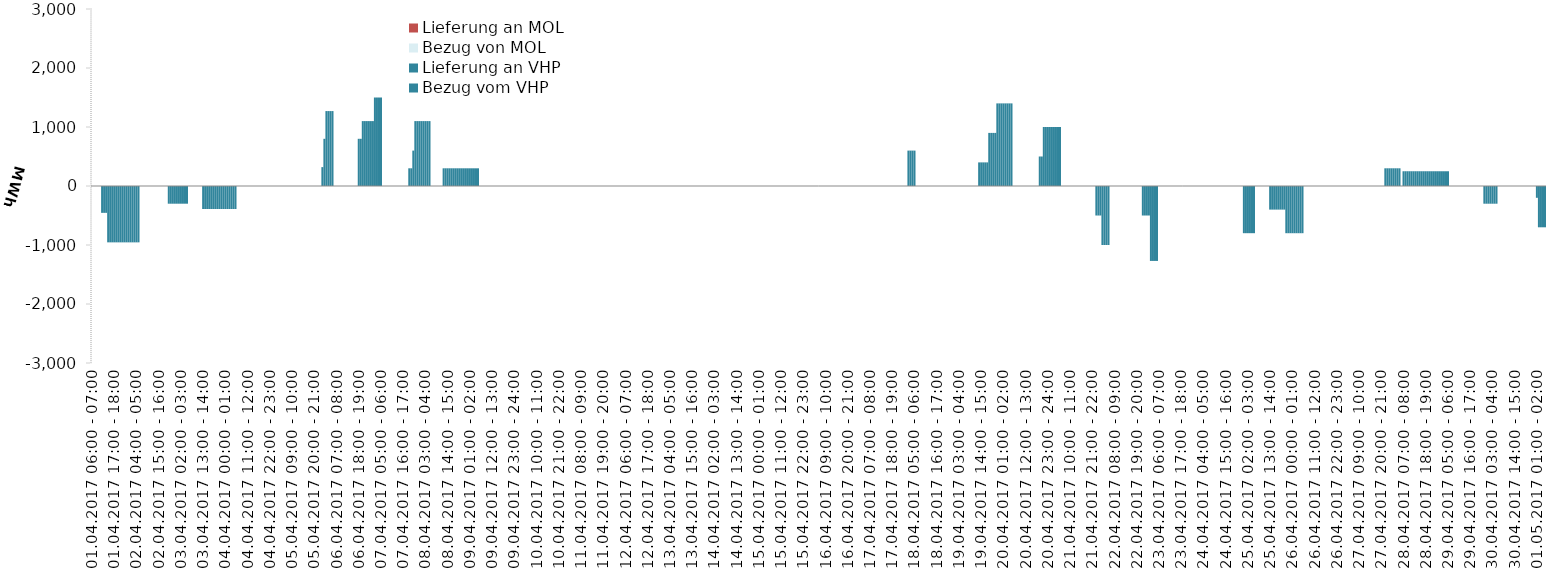
| Category | Bezug vom VHP | Lieferung an VHP | Bezug von MOL | Lieferung an MOL |
|---|---|---|---|---|
| 01.04.2017 06:00 - 07:00 | 0 | 0 | 0 | 0 |
| 01.04.2017 07:00 - 08:00 | 0 | 0 | 0 | 0 |
| 01.04.2017 08:00 - 09:00 | 0 | 0 | 0 | 0 |
| 01.04.2017 09:00 - 10:00 | 0 | 0 | 0 | 0 |
| 01.04.2017 10:00 - 11:00 | 0 | 0 | 0 | 0 |
| 01.04.2017 11:00 - 12:00 | 0 | -455 | 0 | 0 |
| 01.04.2017 12:00 - 13:00 | 0 | -455 | 0 | 0 |
| 01.04.2017 13:00 - 14:00 | 0 | -455 | 0 | 0 |
| 01.04.2017 14:00 - 15:00 | 0 | -955 | 0 | 0 |
| 01.04.2017 15:00 - 16:00 | 0 | -955 | 0 | 0 |
| 01.04.2017 16:00 - 17:00 | 0 | -955 | 0 | 0 |
| 01.04.2017 17:00 - 18:00 | 0 | -955 | 0 | 0 |
| 01.04.2017 18:00 - 19:00 | 0 | -955 | 0 | 0 |
| 01.04.2017 19:00 - 20:00 | 0 | -955 | 0 | 0 |
| 01.04.2017 20:00 - 21:00 | 0 | -955 | 0 | 0 |
| 01.04.2017 21:00 - 22:00 | 0 | -955 | 0 | 0 |
| 01.04.2017 22:00 - 23:00 | 0 | -955 | 0 | 0 |
| 01.04.2017 23:00 - 24:00 | 0 | -955 | 0 | 0 |
| 02.04.2017 00:00 - 01:00 | 0 | -955 | 0 | 0 |
| 02.04.2017 01:00 - 02:00 | 0 | -955 | 0 | 0 |
| 02.04.2017 02:00 - 03:00 | 0 | -955 | 0 | 0 |
| 02.04.2017 03:00 - 04:00 | 0 | -955 | 0 | 0 |
| 02.04.2017 04:00 - 05:00 | 0 | -955 | 0 | 0 |
| 02.04.2017 05:00 - 06:00 | 0 | -955 | 0 | 0 |
| 02.04.2017 06:00 - 07:00 | 0 | 0 | 0 | 0 |
| 02.04.2017 07:00 - 08:00 | 0 | 0 | 0 | 0 |
| 02.04.2017 08:00 - 09:00 | 0 | 0 | 0 | 0 |
| 02.04.2017 09:00 - 10:00 | 0 | 0 | 0 | 0 |
| 02.04.2017 10:00 - 11:00 | 0 | 0 | 0 | 0 |
| 02.04.2017 11:00 - 12:00 | 0 | 0 | 0 | 0 |
| 02.04.2017 12:00 - 13:00 | 0 | 0 | 0 | 0 |
| 02.04.2017 13:00 - 14:00 | 0 | 0 | 0 | 0 |
| 02.04.2017 14:00 - 15:00 | 0 | 0 | 0 | 0 |
| 02.04.2017 15:00 - 16:00 | 0 | 0 | 0 | 0 |
| 02.04.2017 16:00 - 17:00 | 0 | 0 | 0 | 0 |
| 02.04.2017 17:00 - 18:00 | 0 | 0 | 0 | 0 |
| 02.04.2017 18:00 - 19:00 | 0 | 0 | 0 | 0 |
| 02.04.2017 19:00 - 20:00 | 0 | 0 | 0 | 0 |
| 02.04.2017 20:00 - 21:00 | 0 | -300 | 0 | 0 |
| 02.04.2017 21:00 - 22:00 | 0 | -300 | 0 | 0 |
| 02.04.2017 22:00 - 23:00 | 0 | -300 | 0 | 0 |
| 02.04.2017 23:00 - 24:00 | 0 | -300 | 0 | 0 |
| 03.04.2017 00:00 - 01:00 | 0 | -300 | 0 | 0 |
| 03.04.2017 01:00 - 02:00 | 0 | -300 | 0 | 0 |
| 03.04.2017 02:00 - 03:00 | 0 | -300 | 0 | 0 |
| 03.04.2017 03:00 - 04:00 | 0 | -300 | 0 | 0 |
| 03.04.2017 04:00 - 05:00 | 0 | -300 | 0 | 0 |
| 03.04.2017 05:00 - 06:00 | 0 | -300 | 0 | 0 |
| 03.04.2017 06:00 - 07:00 | 0 | 0 | 0 | 0 |
| 03.04.2017 07:00 - 08:00 | 0 | 0 | 0 | 0 |
| 03.04.2017 08:00 - 09:00 | 0 | 0 | 0 | 0 |
| 03.04.2017 09:00 - 10:00 | 0 | 0 | 0 | 0 |
| 03.04.2017 10:00 - 11:00 | 0 | 0 | 0 | 0 |
| 03.04.2017 11:00 - 12:00 | 0 | 0 | 0 | 0 |
| 03.04.2017 12:00 - 13:00 | 0 | 0 | 0 | 0 |
| 03.04.2017 13:00 - 14:00 | 0 | -390 | 0 | 0 |
| 03.04.2017 14:00 - 15:00 | 0 | -390 | 0 | 0 |
| 03.04.2017 15:00 - 16:00 | 0 | -390 | 0 | 0 |
| 03.04.2017 16:00 - 17:00 | 0 | -390 | 0 | 0 |
| 03.04.2017 17:00 - 18:00 | 0 | -390 | 0 | 0 |
| 03.04.2017 18:00 - 19:00 | 0 | -390 | 0 | 0 |
| 03.04.2017 19:00 - 20:00 | 0 | -390 | 0 | 0 |
| 03.04.2017 20:00 - 21:00 | 0 | -390 | 0 | 0 |
| 03.04.2017 21:00 - 22:00 | 0 | -390 | 0 | 0 |
| 03.04.2017 22:00 - 23:00 | 0 | -390 | 0 | 0 |
| 03.04.2017 23:00 - 24:00 | 0 | -390 | 0 | 0 |
| 04.04.2017 00:00 - 01:00 | 0 | -390 | 0 | 0 |
| 04.04.2017 01:00 - 02:00 | 0 | -390 | 0 | 0 |
| 04.04.2017 02:00 - 03:00 | 0 | -390 | 0 | 0 |
| 04.04.2017 03:00 - 04:00 | 0 | -390 | 0 | 0 |
| 04.04.2017 04:00 - 05:00 | 0 | -390 | 0 | 0 |
| 04.04.2017 05:00 - 06:00 | 0 | -390 | 0 | 0 |
| 04.04.2017 06:00 - 07:00 | 0 | 0 | 0 | 0 |
| 04.04.2017 07:00 - 08:00 | 0 | 0 | 0 | 0 |
| 04.04.2017 08:00 - 09:00 | 0 | 0 | 0 | 0 |
| 04.04.2017 09:00 - 10:00 | 0 | 0 | 0 | 0 |
| 04.04.2017 10:00 - 11:00 | 0 | 0 | 0 | 0 |
| 04.04.2017 11:00 - 12:00 | 0 | 0 | 0 | 0 |
| 04.04.2017 12:00 - 13:00 | 0 | 0 | 0 | 0 |
| 04.04.2017 13:00 - 14:00 | 0 | 0 | 0 | 0 |
| 04.04.2017 14:00 - 15:00 | 0 | 0 | 0 | 0 |
| 04.04.2017 15:00 - 16:00 | 0 | 0 | 0 | 0 |
| 04.04.2017 16:00 - 17:00 | 0 | 0 | 0 | 0 |
| 04.04.2017 17:00 - 18:00 | 0 | 0 | 0 | 0 |
| 04.04.2017 18:00 - 19:00 | 0 | 0 | 0 | 0 |
| 04.04.2017 19:00 - 20:00 | 0 | 0 | 0 | 0 |
| 04.04.2017 20:00 - 21:00 | 0 | 0 | 0 | 0 |
| 04.04.2017 21:00 - 22:00 | 0 | 0 | 0 | 0 |
| 04.04.2017 22:00 - 23:00 | 0 | 0 | 0 | 0 |
| 04.04.2017 23:00 - 24:00 | 0 | 0 | 0 | 0 |
| 05.04.2017 00:00 - 01:00 | 0 | 0 | 0 | 0 |
| 05.04.2017 01:00 - 02:00 | 0 | 0 | 0 | 0 |
| 05.04.2017 02:00 - 03:00 | 0 | 0 | 0 | 0 |
| 05.04.2017 03:00 - 04:00 | 0 | 0 | 0 | 0 |
| 05.04.2017 04:00 - 05:00 | 0 | 0 | 0 | 0 |
| 05.04.2017 05:00 - 06:00 | 0 | 0 | 0 | 0 |
| 05.04.2017 06:00 - 07:00 | 0 | 0 | 0 | 0 |
| 05.04.2017 07:00 - 08:00 | 0 | 0 | 0 | 0 |
| 05.04.2017 08:00 - 09:00 | 0 | 0 | 0 | 0 |
| 05.04.2017 09:00 - 10:00 | 0 | 0 | 0 | 0 |
| 05.04.2017 10:00 - 11:00 | 0 | 0 | 0 | 0 |
| 05.04.2017 11:00 - 12:00 | 0 | 0 | 0 | 0 |
| 05.04.2017 12:00 - 13:00 | 0 | 0 | 0 | 0 |
| 05.04.2017 13:00 - 14:00 | 0 | 0 | 0 | 0 |
| 05.04.2017 14:00 - 15:00 | 0 | 0 | 0 | 0 |
| 05.04.2017 15:00 - 16:00 | 0 | 0 | 0 | 0 |
| 05.04.2017 16:00 - 17:00 | 0 | 0 | 0 | 0 |
| 05.04.2017 17:00 - 18:00 | 0 | 0 | 0 | 0 |
| 05.04.2017 18:00 - 19:00 | 0 | 0 | 0 | 0 |
| 05.04.2017 19:00 - 20:00 | 0 | 0 | 0 | 0 |
| 05.04.2017 20:00 - 21:00 | 0 | 0 | 0 | 0 |
| 05.04.2017 21:00 - 22:00 | 0 | 0 | 0 | 0 |
| 05.04.2017 22:00 - 23:00 | 0 | 0 | 0 | 0 |
| 05.04.2017 23:00 - 24:00 | 0 | 0 | 0 | 0 |
| 06.04.2017 00:00 - 01:00 | 320 | 0 | 0 | 0 |
| 06.04.2017 01:00 - 02:00 | 800 | 0 | 0 | 0 |
| 06.04.2017 02:00 - 03:00 | 1270 | 0 | 0 | 0 |
| 06.04.2017 03:00 - 04:00 | 1270 | 0 | 0 | 0 |
| 06.04.2017 04:00 - 05:00 | 1270 | 0 | 0 | 0 |
| 06.04.2017 05:00 - 06:00 | 1270 | 0 | 0 | 0 |
| 06.04.2017 06:00 - 07:00 | 0 | 0 | 0 | 0 |
| 06.04.2017 07:00 - 08:00 | 0 | 0 | 0 | 0 |
| 06.04.2017 08:00 - 09:00 | 0 | 0 | 0 | 0 |
| 06.04.2017 09:00 - 10:00 | 0 | 0 | 0 | 0 |
| 06.04.2017 10:00 - 11:00 | 0 | 0 | 0 | 0 |
| 06.04.2017 11:00 - 12:00 | 0 | 0 | 0 | 0 |
| 06.04.2017 12:00 - 13:00 | 0 | 0 | 0 | 0 |
| 06.04.2017 13:00 - 14:00 | 0 | 0 | 0 | 0 |
| 06.04.2017 14:00 - 15:00 | 0 | 0 | 0 | 0 |
| 06.04.2017 15:00 - 16:00 | 0 | 0 | 0 | 0 |
| 06.04.2017 16:00 - 17:00 | 0 | 0 | 0 | 0 |
| 06.04.2017 17:00 - 18:00 | 0 | 0 | 0 | 0 |
| 06.04.2017 18:00 - 19:00 | 800 | 0 | 0 | 0 |
| 06.04.2017 19:00 - 20:00 | 800 | 0 | 0 | 0 |
| 06.04.2017 20:00 - 21:00 | 1100 | 0 | 0 | 0 |
| 06.04.2017 21:00 - 22:00 | 1100 | 0 | 0 | 0 |
| 06.04.2017 22:00 - 23:00 | 1100 | 0 | 0 | 0 |
| 06.04.2017 23:00 - 24:00 | 1100 | 0 | 0 | 0 |
| 07.04.2017 00:00 - 01:00 | 1100 | 0 | 0 | 0 |
| 07.04.2017 01:00 - 02:00 | 1100 | 0 | 0 | 0 |
| 07.04.2017 02:00 - 03:00 | 1500 | 0 | 0 | 0 |
| 07.04.2017 03:00 - 04:00 | 1500 | 0 | 0 | 0 |
| 07.04.2017 04:00 - 05:00 | 1500 | 0 | 0 | 0 |
| 07.04.2017 05:00 - 06:00 | 1500 | 0 | 0 | 0 |
| 07.04.2017 06:00 - 07:00 | 0 | 0 | 0 | 0 |
| 07.04.2017 07:00 - 08:00 | 0 | 0 | 0 | 0 |
| 07.04.2017 08:00 - 09:00 | 0 | 0 | 0 | 0 |
| 07.04.2017 09:00 - 10:00 | 0 | 0 | 0 | 0 |
| 07.04.2017 10:00 - 11:00 | 0 | 0 | 0 | 0 |
| 07.04.2017 11:00 - 12:00 | 0 | 0 | 0 | 0 |
| 07.04.2017 12:00 - 13:00 | 0 | 0 | 0 | 0 |
| 07.04.2017 13:00 - 14:00 | 0 | 0 | 0 | 0 |
| 07.04.2017 14:00 - 15:00 | 0 | 0 | 0 | 0 |
| 07.04.2017 15:00 - 16:00 | 0 | 0 | 0 | 0 |
| 07.04.2017 16:00 - 17:00 | 0 | 0 | 0 | 0 |
| 07.04.2017 17:00 - 18:00 | 0 | 0 | 0 | 0 |
| 07.04.2017 18:00 - 19:00 | 0 | 0 | 0 | 0 |
| 07.04.2017 19:00 - 20:00 | 300 | 0 | 0 | 0 |
| 07.04.2017 20:00 - 21:00 | 300 | 0 | 0 | 0 |
| 07.04.2017 21:00 - 22:00 | 600 | 0 | 0 | 0 |
| 07.04.2017 22:00 - 23:00 | 1100 | 0 | 0 | 0 |
| 07.04.2017 23:00 - 24:00 | 1100 | 0 | 0 | 0 |
| 08.04.2017 00:00 - 01:00 | 1100 | 0 | 0 | 0 |
| 08.04.2017 01:00 - 02:00 | 1100 | 0 | 0 | 0 |
| 08.04.2017 02:00 - 03:00 | 1100 | 0 | 0 | 0 |
| 08.04.2017 03:00 - 04:00 | 1100 | 0 | 0 | 0 |
| 08.04.2017 04:00 - 05:00 | 1100 | 0 | 0 | 0 |
| 08.04.2017 05:00 - 06:00 | 1100 | 0 | 0 | 0 |
| 08.04.2017 06:00 - 07:00 | 0 | 0 | 0 | 0 |
| 08.04.2017 07:00 - 08:00 | 0 | 0 | 0 | 0 |
| 08.04.2017 08:00 - 09:00 | 0 | 0 | 0 | 0 |
| 08.04.2017 09:00 - 10:00 | 0 | 0 | 0 | 0 |
| 08.04.2017 10:00 - 11:00 | 0 | 0 | 0 | 0 |
| 08.04.2017 11:00 - 12:00 | 0 | 0 | 0 | 0 |
| 08.04.2017 12:00 - 13:00 | 300 | 0 | 0 | 0 |
| 08.04.2017 13:00 - 14:00 | 300 | 0 | 0 | 0 |
| 08.04.2017 14:00 - 15:00 | 300 | 0 | 0 | 0 |
| 08.04.2017 15:00 - 16:00 | 300 | 0 | 0 | 0 |
| 08.04.2017 16:00 - 17:00 | 300 | 0 | 0 | 0 |
| 08.04.2017 17:00 - 18:00 | 300 | 0 | 0 | 0 |
| 08.04.2017 18:00 - 19:00 | 300 | 0 | 0 | 0 |
| 08.04.2017 19:00 - 20:00 | 300 | 0 | 0 | 0 |
| 08.04.2017 20:00 - 21:00 | 300 | 0 | 0 | 0 |
| 08.04.2017 21:00 - 22:00 | 300 | 0 | 0 | 0 |
| 08.04.2017 22:00 - 23:00 | 300 | 0 | 0 | 0 |
| 08.04.2017 23:00 - 24:00 | 300 | 0 | 0 | 0 |
| 09.04.2017 00:00 - 01:00 | 300 | 0 | 0 | 0 |
| 09.04.2017 01:00 - 02:00 | 300 | 0 | 0 | 0 |
| 09.04.2017 02:00 - 03:00 | 300 | 0 | 0 | 0 |
| 09.04.2017 03:00 - 04:00 | 300 | 0 | 0 | 0 |
| 09.04.2017 04:00 - 05:00 | 300 | 0 | 0 | 0 |
| 09.04.2017 05:00 - 06:00 | 300 | 0 | 0 | 0 |
| 09.04.2017 06:00 - 07:00 | 0 | 0 | 0 | 0 |
| 09.04.2017 07:00 - 08:00 | 0 | 0 | 0 | 0 |
| 09.04.2017 08:00 - 09:00 | 0 | 0 | 0 | 0 |
| 09.04.2017 09:00 - 10:00 | 0 | 0 | 0 | 0 |
| 09.04.2017 10:00 - 11:00 | 0 | 0 | 0 | 0 |
| 09.04.2017 11:00 - 12:00 | 0 | 0 | 0 | 0 |
| 09.04.2017 12:00 - 13:00 | 0 | 0 | 0 | 0 |
| 09.04.2017 13:00 - 14:00 | 0 | 0 | 0 | 0 |
| 09.04.2017 14:00 - 15:00 | 0 | 0 | 0 | 0 |
| 09.04.2017 15:00 - 16:00 | 0 | 0 | 0 | 0 |
| 09.04.2017 16:00 - 17:00 | 0 | 0 | 0 | 0 |
| 09.04.2017 17:00 - 18:00 | 0 | 0 | 0 | 0 |
| 09.04.2017 18:00 - 19:00 | 0 | 0 | 0 | 0 |
| 09.04.2017 19:00 - 20:00 | 0 | 0 | 0 | 0 |
| 09.04.2017 20:00 - 21:00 | 0 | 0 | 0 | 0 |
| 09.04.2017 21:00 - 22:00 | 0 | 0 | 0 | 0 |
| 09.04.2017 22:00 - 23:00 | 0 | 0 | 0 | 0 |
| 09.04.2017 23:00 - 24:00 | 0 | 0 | 0 | 0 |
| 10.04.2017 00:00 - 01:00 | 0 | 0 | 0 | 0 |
| 10.04.2017 01:00 - 02:00 | 0 | 0 | 0 | 0 |
| 10.04.2017 02:00 - 03:00 | 0 | 0 | 0 | 0 |
| 10.04.2017 03:00 - 04:00 | 0 | 0 | 0 | 0 |
| 10.04.2017 04:00 - 05:00 | 0 | 0 | 0 | 0 |
| 10.04.2017 05:00 - 06:00 | 0 | 0 | 0 | 0 |
| 10.04.2017 06:00 - 07:00 | 0 | 0 | 0 | 0 |
| 10.04.2017 07:00 - 08:00 | 0 | 0 | 0 | 0 |
| 10.04.2017 08:00 - 09:00 | 0 | 0 | 0 | 0 |
| 10.04.2017 09:00 - 10:00 | 0 | 0 | 0 | 0 |
| 10.04.2017 10:00 - 11:00 | 0 | 0 | 0 | 0 |
| 10.04.2017 11:00 - 12:00 | 0 | 0 | 0 | 0 |
| 10.04.2017 12:00 - 13:00 | 0 | 0 | 0 | 0 |
| 10.04.2017 13:00 - 14:00 | 0 | 0 | 0 | 0 |
| 10.04.2017 14:00 - 15:00 | 0 | 0 | 0 | 0 |
| 10.04.2017 15:00 - 16:00 | 0 | 0 | 0 | 0 |
| 10.04.2017 16:00 - 17:00 | 0 | 0 | 0 | 0 |
| 10.04.2017 17:00 - 18:00 | 0 | 0 | 0 | 0 |
| 10.04.2017 18:00 - 19:00 | 0 | 0 | 0 | 0 |
| 10.04.2017 19:00 - 20:00 | 0 | 0 | 0 | 0 |
| 10.04.2017 20:00 - 21:00 | 0 | 0 | 0 | 0 |
| 10.04.2017 21:00 - 22:00 | 0 | 0 | 0 | 0 |
| 10.04.2017 22:00 - 23:00 | 0 | 0 | 0 | 0 |
| 10.04.2017 23:00 - 24:00 | 0 | 0 | 0 | 0 |
| 11.04.2017 00:00 - 01:00 | 0 | 0 | 0 | 0 |
| 11.04.2017 01:00 - 02:00 | 0 | 0 | 0 | 0 |
| 11.04.2017 02:00 - 03:00 | 0 | 0 | 0 | 0 |
| 11.04.2017 03:00 - 04:00 | 0 | 0 | 0 | 0 |
| 11.04.2017 04:00 - 05:00 | 0 | 0 | 0 | 0 |
| 11.04.2017 05:00 - 06:00 | 0 | 0 | 0 | 0 |
| 11.04.2017 06:00 - 07:00 | 0 | 0 | 0 | 0 |
| 11.04.2017 07:00 - 08:00 | 0 | 0 | 0 | 0 |
| 11.04.2017 08:00 - 09:00 | 0 | 0 | 0 | 0 |
| 11.04.2017 09:00 - 10:00 | 0 | 0 | 0 | 0 |
| 11.04.2017 10:00 - 11:00 | 0 | 0 | 0 | 0 |
| 11.04.2017 11:00 - 12:00 | 0 | 0 | 0 | 0 |
| 11.04.2017 12:00 - 13:00 | 0 | 0 | 0 | 0 |
| 11.04.2017 13:00 - 14:00 | 0 | 0 | 0 | 0 |
| 11.04.2017 14:00 - 15:00 | 0 | 0 | 0 | 0 |
| 11.04.2017 15:00 - 16:00 | 0 | 0 | 0 | 0 |
| 11.04.2017 16:00 - 17:00 | 0 | 0 | 0 | 0 |
| 11.04.2017 17:00 - 18:00 | 0 | 0 | 0 | 0 |
| 11.04.2017 18:00 - 19:00 | 0 | 0 | 0 | 0 |
| 11.04.2017 19:00 - 20:00 | 0 | 0 | 0 | 0 |
| 11.04.2017 20:00 - 21:00 | 0 | 0 | 0 | 0 |
| 11.04.2017 21:00 - 22:00 | 0 | 0 | 0 | 0 |
| 11.04.2017 22:00 - 23:00 | 0 | 0 | 0 | 0 |
| 11.04.2017 23:00 - 24:00 | 0 | 0 | 0 | 0 |
| 12.04.2017 00:00 - 01:00 | 0 | 0 | 0 | 0 |
| 12.04.2017 01:00 - 02:00 | 0 | 0 | 0 | 0 |
| 12.04.2017 02:00 - 03:00 | 0 | 0 | 0 | 0 |
| 12.04.2017 03:00 - 04:00 | 0 | 0 | 0 | 0 |
| 12.04.2017 04:00 - 05:00 | 0 | 0 | 0 | 0 |
| 12.04.2017 05:00 - 06:00 | 0 | 0 | 0 | 0 |
| 12.04.2017 06:00 - 07:00 | 0 | 0 | 0 | 0 |
| 12.04.2017 07:00 - 08:00 | 0 | 0 | 0 | 0 |
| 12.04.2017 08:00 - 09:00 | 0 | 0 | 0 | 0 |
| 12.04.2017 09:00 - 10:00 | 0 | 0 | 0 | 0 |
| 12.04.2017 10:00 - 11:00 | 0 | 0 | 0 | 0 |
| 12.04.2017 11:00 - 12:00 | 0 | 0 | 0 | 0 |
| 12.04.2017 12:00 - 13:00 | 0 | 0 | 0 | 0 |
| 12.04.2017 13:00 - 14:00 | 0 | 0 | 0 | 0 |
| 12.04.2017 14:00 - 15:00 | 0 | 0 | 0 | 0 |
| 12.04.2017 15:00 - 16:00 | 0 | 0 | 0 | 0 |
| 12.04.2017 16:00 - 17:00 | 0 | 0 | 0 | 0 |
| 12.04.2017 17:00 - 18:00 | 0 | 0 | 0 | 0 |
| 12.04.2017 18:00 - 19:00 | 0 | 0 | 0 | 0 |
| 12.04.2017 19:00 - 20:00 | 0 | 0 | 0 | 0 |
| 12.04.2017 20:00 - 21:00 | 0 | 0 | 0 | 0 |
| 12.04.2017 21:00 - 22:00 | 0 | 0 | 0 | 0 |
| 12.04.2017 22:00 - 23:00 | 0 | 0 | 0 | 0 |
| 12.04.2017 23:00 - 24:00 | 0 | 0 | 0 | 0 |
| 13.04.2017 00:00 - 01:00 | 0 | 0 | 0 | 0 |
| 13.04.2017 01:00 - 02:00 | 0 | 0 | 0 | 0 |
| 13.04.2017 02:00 - 03:00 | 0 | 0 | 0 | 0 |
| 13.04.2017 03:00 - 04:00 | 0 | 0 | 0 | 0 |
| 13.04.2017 04:00 - 05:00 | 0 | 0 | 0 | 0 |
| 13.04.2017 05:00 - 06:00 | 0 | 0 | 0 | 0 |
| 13.04.2017 06:00 - 07:00 | 0 | 0 | 0 | 0 |
| 13.04.2017 07:00 - 08:00 | 0 | 0 | 0 | 0 |
| 13.04.2017 08:00 - 09:00 | 0 | 0 | 0 | 0 |
| 13.04.2017 09:00 - 10:00 | 0 | 0 | 0 | 0 |
| 13.04.2017 10:00 - 11:00 | 0 | 0 | 0 | 0 |
| 13.04.2017 11:00 - 12:00 | 0 | 0 | 0 | 0 |
| 13.04.2017 12:00 - 13:00 | 0 | 0 | 0 | 0 |
| 13.04.2017 13:00 - 14:00 | 0 | 0 | 0 | 0 |
| 13.04.2017 14:00 - 15:00 | 0 | 0 | 0 | 0 |
| 13.04.2017 15:00 - 16:00 | 0 | 0 | 0 | 0 |
| 13.04.2017 16:00 - 17:00 | 0 | 0 | 0 | 0 |
| 13.04.2017 17:00 - 18:00 | 0 | 0 | 0 | 0 |
| 13.04.2017 18:00 - 19:00 | 0 | 0 | 0 | 0 |
| 13.04.2017 19:00 - 20:00 | 0 | 0 | 0 | 0 |
| 13.04.2017 20:00 - 21:00 | 0 | 0 | 0 | 0 |
| 13.04.2017 21:00 - 22:00 | 0 | 0 | 0 | 0 |
| 13.04.2017 22:00 - 23:00 | 0 | 0 | 0 | 0 |
| 13.04.2017 23:00 - 24:00 | 0 | 0 | 0 | 0 |
| 14.04.2017 00:00 - 01:00 | 0 | 0 | 0 | 0 |
| 14.04.2017 01:00 - 02:00 | 0 | 0 | 0 | 0 |
| 14.04.2017 02:00 - 03:00 | 0 | 0 | 0 | 0 |
| 14.04.2017 03:00 - 04:00 | 0 | 0 | 0 | 0 |
| 14.04.2017 04:00 - 05:00 | 0 | 0 | 0 | 0 |
| 14.04.2017 05:00 - 06:00 | 0 | 0 | 0 | 0 |
| 14.04.2017 06:00 - 07:00 | 0 | 0 | 0 | 0 |
| 14.04.2017 07:00 - 08:00 | 0 | 0 | 0 | 0 |
| 14.04.2017 08:00 - 09:00 | 0 | 0 | 0 | 0 |
| 14.04.2017 09:00 - 10:00 | 0 | 0 | 0 | 0 |
| 14.04.2017 10:00 - 11:00 | 0 | 0 | 0 | 0 |
| 14.04.2017 11:00 - 12:00 | 0 | 0 | 0 | 0 |
| 14.04.2017 12:00 - 13:00 | 0 | 0 | 0 | 0 |
| 14.04.2017 13:00 - 14:00 | 0 | 0 | 0 | 0 |
| 14.04.2017 14:00 - 15:00 | 0 | 0 | 0 | 0 |
| 14.04.2017 15:00 - 16:00 | 0 | 0 | 0 | 0 |
| 14.04.2017 16:00 - 17:00 | 0 | 0 | 0 | 0 |
| 14.04.2017 17:00 - 18:00 | 0 | 0 | 0 | 0 |
| 14.04.2017 18:00 - 19:00 | 0 | 0 | 0 | 0 |
| 14.04.2017 19:00 - 20:00 | 0 | 0 | 0 | 0 |
| 14.04.2017 20:00 - 21:00 | 0 | 0 | 0 | 0 |
| 14.04.2017 21:00 - 22:00 | 0 | 0 | 0 | 0 |
| 14.04.2017 22:00 - 23:00 | 0 | 0 | 0 | 0 |
| 14.04.2017 23:00 - 24:00 | 0 | 0 | 0 | 0 |
| 15.04.2017 00:00 - 01:00 | 0 | 0 | 0 | 0 |
| 15.04.2017 01:00 - 02:00 | 0 | 0 | 0 | 0 |
| 15.04.2017 02:00 - 03:00 | 0 | 0 | 0 | 0 |
| 15.04.2017 03:00 - 04:00 | 0 | 0 | 0 | 0 |
| 15.04.2017 04:00 - 05:00 | 0 | 0 | 0 | 0 |
| 15.04.2017 05:00 - 06:00 | 0 | 0 | 0 | 0 |
| 15.04.2017 06:00 - 07:00 | 0 | 0 | 0 | 0 |
| 15.04.2017 07:00 - 08:00 | 0 | 0 | 0 | 0 |
| 15.04.2017 08:00 - 09:00 | 0 | 0 | 0 | 0 |
| 15.04.2017 09:00 - 10:00 | 0 | 0 | 0 | 0 |
| 15.04.2017 10:00 - 11:00 | 0 | 0 | 0 | 0 |
| 15.04.2017 11:00 - 12:00 | 0 | 0 | 0 | 0 |
| 15.04.2017 12:00 - 13:00 | 0 | 0 | 0 | 0 |
| 15.04.2017 13:00 - 14:00 | 0 | 0 | 0 | 0 |
| 15.04.2017 14:00 - 15:00 | 0 | 0 | 0 | 0 |
| 15.04.2017 15:00 - 16:00 | 0 | 0 | 0 | 0 |
| 15.04.2017 16:00 - 17:00 | 0 | 0 | 0 | 0 |
| 15.04.2017 17:00 - 18:00 | 0 | 0 | 0 | 0 |
| 15.04.2017 18:00 - 19:00 | 0 | 0 | 0 | 0 |
| 15.04.2017 19:00 - 20:00 | 0 | 0 | 0 | 0 |
| 15.04.2017 20:00 - 21:00 | 0 | 0 | 0 | 0 |
| 15.04.2017 21:00 - 22:00 | 0 | 0 | 0 | 0 |
| 15.04.2017 22:00 - 23:00 | 0 | 0 | 0 | 0 |
| 15.04.2017 23:00 - 24:00 | 0 | 0 | 0 | 0 |
| 16.04.2017 00:00 - 01:00 | 0 | 0 | 0 | 0 |
| 16.04.2017 01:00 - 02:00 | 0 | 0 | 0 | 0 |
| 16.04.2017 02:00 - 03:00 | 0 | 0 | 0 | 0 |
| 16.04.2017 03:00 - 04:00 | 0 | 0 | 0 | 0 |
| 16.04.2017 04:00 - 05:00 | 0 | 0 | 0 | 0 |
| 16.04.2017 05:00 - 06:00 | 0 | 0 | 0 | 0 |
| 16.04.2017 06:00 - 07:00 | 0 | 0 | 0 | 0 |
| 16.04.2017 07:00 - 08:00 | 0 | 0 | 0 | 0 |
| 16.04.2017 08:00 - 09:00 | 0 | 0 | 0 | 0 |
| 16.04.2017 09:00 - 10:00 | 0 | 0 | 0 | 0 |
| 16.04.2017 10:00 - 11:00 | 0 | 0 | 0 | 0 |
| 16.04.2017 11:00 - 12:00 | 0 | 0 | 0 | 0 |
| 16.04.2017 12:00 - 13:00 | 0 | 0 | 0 | 0 |
| 16.04.2017 13:00 - 14:00 | 0 | 0 | 0 | 0 |
| 16.04.2017 14:00 - 15:00 | 0 | 0 | 0 | 0 |
| 16.04.2017 15:00 - 16:00 | 0 | 0 | 0 | 0 |
| 16.04.2017 16:00 - 17:00 | 0 | 0 | 0 | 0 |
| 16.04.2017 17:00 - 18:00 | 0 | 0 | 0 | 0 |
| 16.04.2017 18:00 - 19:00 | 0 | 0 | 0 | 0 |
| 16.04.2017 19:00 - 20:00 | 0 | 0 | 0 | 0 |
| 16.04.2017 20:00 - 21:00 | 0 | 0 | 0 | 0 |
| 16.04.2017 21:00 - 22:00 | 0 | 0 | 0 | 0 |
| 16.04.2017 22:00 - 23:00 | 0 | 0 | 0 | 0 |
| 16.04.2017 23:00 - 24:00 | 0 | 0 | 0 | 0 |
| 17.04.2017 00:00 - 01:00 | 0 | 0 | 0 | 0 |
| 17.04.2017 01:00 - 02:00 | 0 | 0 | 0 | 0 |
| 17.04.2017 02:00 - 03:00 | 0 | 0 | 0 | 0 |
| 17.04.2017 03:00 - 04:00 | 0 | 0 | 0 | 0 |
| 17.04.2017 04:00 - 05:00 | 0 | 0 | 0 | 0 |
| 17.04.2017 05:00 - 06:00 | 0 | 0 | 0 | 0 |
| 17.04.2017 06:00 - 07:00 | 0 | 0 | 0 | 0 |
| 17.04.2017 07:00 - 08:00 | 0 | 0 | 0 | 0 |
| 17.04.2017 08:00 - 09:00 | 0 | 0 | 0 | 0 |
| 17.04.2017 09:00 - 10:00 | 0 | 0 | 0 | 0 |
| 17.04.2017 10:00 - 11:00 | 0 | 0 | 0 | 0 |
| 17.04.2017 11:00 - 12:00 | 0 | 0 | 0 | 0 |
| 17.04.2017 12:00 - 13:00 | 0 | 0 | 0 | 0 |
| 17.04.2017 13:00 - 14:00 | 0 | 0 | 0 | 0 |
| 17.04.2017 14:00 - 15:00 | 0 | 0 | 0 | 0 |
| 17.04.2017 15:00 - 16:00 | 0 | 0 | 0 | 0 |
| 17.04.2017 16:00 - 17:00 | 0 | 0 | 0 | 0 |
| 17.04.2017 17:00 - 18:00 | 0 | 0 | 0 | 0 |
| 17.04.2017 18:00 - 19:00 | 0 | 0 | 0 | 0 |
| 17.04.2017 19:00 - 20:00 | 0 | 0 | 0 | 0 |
| 17.04.2017 20:00 - 21:00 | 0 | 0 | 0 | 0 |
| 17.04.2017 21:00 - 22:00 | 0 | 0 | 0 | 0 |
| 17.04.2017 22:00 - 23:00 | 0 | 0 | 0 | 0 |
| 17.04.2017 23:00 - 24:00 | 0 | 0 | 0 | 0 |
| 18.04.2017 00:00 - 01:00 | 0 | 0 | 0 | 0 |
| 18.04.2017 01:00 - 02:00 | 0 | 0 | 0 | 0 |
| 18.04.2017 02:00 - 03:00 | 600 | 0 | 0 | 0 |
| 18.04.2017 03:00 - 04:00 | 600 | 0 | 0 | 0 |
| 18.04.2017 04:00 - 05:00 | 600 | 0 | 0 | 0 |
| 18.04.2017 05:00 - 06:00 | 600 | 0 | 0 | 0 |
| 18.04.2017 06:00 - 07:00 | 0 | 0 | 0 | 0 |
| 18.04.2017 07:00 - 08:00 | 0 | 0 | 0 | 0 |
| 18.04.2017 08:00 - 09:00 | 0 | 0 | 0 | 0 |
| 18.04.2017 09:00 - 10:00 | 0 | 0 | 0 | 0 |
| 18.04.2017 10:00 - 11:00 | 0 | 0 | 0 | 0 |
| 18.04.2017 11:00 - 12:00 | 0 | 0 | 0 | 0 |
| 18.04.2017 12:00 - 13:00 | 0 | 0 | 0 | 0 |
| 18.04.2017 13:00 - 14:00 | 0 | 0 | 0 | 0 |
| 18.04.2017 14:00 - 15:00 | 0 | 0 | 0 | 0 |
| 18.04.2017 15:00 - 16:00 | 0 | 0 | 0 | 0 |
| 18.04.2017 16:00 - 17:00 | 0 | 0 | 0 | 0 |
| 18.04.2017 17:00 - 18:00 | 0 | 0 | 0 | 0 |
| 18.04.2017 18:00 - 19:00 | 0 | 0 | 0 | 0 |
| 18.04.2017 19:00 - 20:00 | 0 | 0 | 0 | 0 |
| 18.04.2017 20:00 - 21:00 | 0 | 0 | 0 | 0 |
| 18.04.2017 21:00 - 22:00 | 0 | 0 | 0 | 0 |
| 18.04.2017 22:00 - 23:00 | 0 | 0 | 0 | 0 |
| 18.04.2017 23:00 - 24:00 | 0 | 0 | 0 | 0 |
| 19.04.2017 00:00 - 01:00 | 0 | 0 | 0 | 0 |
| 19.04.2017 01:00 - 02:00 | 0 | 0 | 0 | 0 |
| 19.04.2017 02:00 - 03:00 | 0 | 0 | 0 | 0 |
| 19.04.2017 03:00 - 04:00 | 0 | 0 | 0 | 0 |
| 19.04.2017 04:00 - 05:00 | 0 | 0 | 0 | 0 |
| 19.04.2017 05:00 - 06:00 | 0 | 0 | 0 | 0 |
| 19.04.2017 06:00 - 07:00 | 0 | 0 | 0 | 0 |
| 19.04.2017 07:00 - 08:00 | 0 | 0 | 0 | 0 |
| 19.04.2017 08:00 - 09:00 | 0 | 0 | 0 | 0 |
| 19.04.2017 09:00 - 10:00 | 0 | 0 | 0 | 0 |
| 19.04.2017 10:00 - 11:00 | 0 | 0 | 0 | 0 |
| 19.04.2017 11:00 - 12:00 | 0 | 0 | 0 | 0 |
| 19.04.2017 12:00 - 13:00 | 0 | 0 | 0 | 0 |
| 19.04.2017 13:00 - 14:00 | 400 | 0 | 0 | 0 |
| 19.04.2017 14:00 - 15:00 | 400 | 0 | 0 | 0 |
| 19.04.2017 15:00 - 16:00 | 400 | 0 | 0 | 0 |
| 19.04.2017 16:00 - 17:00 | 400 | 0 | 0 | 0 |
| 19.04.2017 17:00 - 18:00 | 400 | 0 | 0 | 0 |
| 19.04.2017 18:00 - 19:00 | 900 | 0 | 0 | 0 |
| 19.04.2017 19:00 - 20:00 | 900 | 0 | 0 | 0 |
| 19.04.2017 20:00 - 21:00 | 900 | 0 | 0 | 0 |
| 19.04.2017 21:00 - 22:00 | 900 | 0 | 0 | 0 |
| 19.04.2017 22:00 - 23:00 | 1400 | 0 | 0 | 0 |
| 19.04.2017 23:00 - 24:00 | 1400 | 0 | 0 | 0 |
| 20.04.2017 00:00 - 01:00 | 1400 | 0 | 0 | 0 |
| 20.04.2017 01:00 - 02:00 | 1400 | 0 | 0 | 0 |
| 20.04.2017 02:00 - 03:00 | 1400 | 0 | 0 | 0 |
| 20.04.2017 03:00 - 04:00 | 1400 | 0 | 0 | 0 |
| 20.04.2017 04:00 - 05:00 | 1400 | 0 | 0 | 0 |
| 20.04.2017 05:00 - 06:00 | 1400 | 0 | 0 | 0 |
| 20.04.2017 06:00 - 07:00 | 0 | 0 | 0 | 0 |
| 20.04.2017 07:00 - 08:00 | 0 | 0 | 0 | 0 |
| 20.04.2017 08:00 - 09:00 | 0 | 0 | 0 | 0 |
| 20.04.2017 09:00 - 10:00 | 0 | 0 | 0 | 0 |
| 20.04.2017 10:00 - 11:00 | 0 | 0 | 0 | 0 |
| 20.04.2017 11:00 - 12:00 | 0 | 0 | 0 | 0 |
| 20.04.2017 12:00 - 13:00 | 0 | 0 | 0 | 0 |
| 20.04.2017 13:00 - 14:00 | 0 | 0 | 0 | 0 |
| 20.04.2017 14:00 - 15:00 | 0 | 0 | 0 | 0 |
| 20.04.2017 15:00 - 16:00 | 0 | 0 | 0 | 0 |
| 20.04.2017 16:00 - 17:00 | 0 | 0 | 0 | 0 |
| 20.04.2017 17:00 - 18:00 | 0 | 0 | 0 | 0 |
| 20.04.2017 18:00 - 19:00 | 0 | 0 | 0 | 0 |
| 20.04.2017 19:00 - 20:00 | 500 | 0 | 0 | 0 |
| 20.04.2017 20:00 - 21:00 | 500 | 0 | 0 | 0 |
| 20.04.2017 21:00 - 22:00 | 1000 | 0 | 0 | 0 |
| 20.04.2017 22:00 - 23:00 | 1000 | 0 | 0 | 0 |
| 20.04.2017 23:00 - 24:00 | 1000 | 0 | 0 | 0 |
| 21.04.2017 00:00 - 01:00 | 1000 | 0 | 0 | 0 |
| 21.04.2017 01:00 - 02:00 | 1000 | 0 | 0 | 0 |
| 21.04.2017 02:00 - 03:00 | 1000 | 0 | 0 | 0 |
| 21.04.2017 03:00 - 04:00 | 1000 | 0 | 0 | 0 |
| 21.04.2017 04:00 - 05:00 | 1000 | 0 | 0 | 0 |
| 21.04.2017 05:00 - 06:00 | 1000 | 0 | 0 | 0 |
| 21.04.2017 06:00 - 07:00 | 0 | 0 | 0 | 0 |
| 21.04.2017 07:00 - 08:00 | 0 | 0 | 0 | 0 |
| 21.04.2017 08:00 - 09:00 | 0 | 0 | 0 | 0 |
| 21.04.2017 09:00 - 10:00 | 0 | 0 | 0 | 0 |
| 21.04.2017 10:00 - 11:00 | 0 | 0 | 0 | 0 |
| 21.04.2017 11:00 - 12:00 | 0 | 0 | 0 | 0 |
| 21.04.2017 12:00 - 13:00 | 0 | 0 | 0 | 0 |
| 21.04.2017 13:00 - 14:00 | 0 | 0 | 0 | 0 |
| 21.04.2017 14:00 - 15:00 | 0 | 0 | 0 | 0 |
| 21.04.2017 15:00 - 16:00 | 0 | 0 | 0 | 0 |
| 21.04.2017 16:00 - 17:00 | 0 | 0 | 0 | 0 |
| 21.04.2017 17:00 - 18:00 | 0 | 0 | 0 | 0 |
| 21.04.2017 18:00 - 19:00 | 0 | 0 | 0 | 0 |
| 21.04.2017 19:00 - 20:00 | 0 | 0 | 0 | 0 |
| 21.04.2017 20:00 - 21:00 | 0 | 0 | 0 | 0 |
| 21.04.2017 21:00 - 22:00 | 0 | 0 | 0 | 0 |
| 21.04.2017 22:00 - 23:00 | 0 | 0 | 0 | 0 |
| 21.04.2017 23:00 - 24:00 | 0 | -500 | 0 | 0 |
| 22.04.2017 00:00 - 01:00 | 0 | -500 | 0 | 0 |
| 22.04.2017 01:00 - 02:00 | 0 | -500 | 0 | 0 |
| 22.04.2017 02:00 - 03:00 | 0 | -1000 | 0 | 0 |
| 22.04.2017 03:00 - 04:00 | 0 | -1000 | 0 | 0 |
| 22.04.2017 04:00 - 05:00 | 0 | -1000 | 0 | 0 |
| 22.04.2017 05:00 - 06:00 | 0 | -1000 | 0 | 0 |
| 22.04.2017 06:00 - 07:00 | 0 | 0 | 0 | 0 |
| 22.04.2017 07:00 - 08:00 | 0 | 0 | 0 | 0 |
| 22.04.2017 08:00 - 09:00 | 0 | 0 | 0 | 0 |
| 22.04.2017 09:00 - 10:00 | 0 | 0 | 0 | 0 |
| 22.04.2017 10:00 - 11:00 | 0 | 0 | 0 | 0 |
| 22.04.2017 11:00 - 12:00 | 0 | 0 | 0 | 0 |
| 22.04.2017 12:00 - 13:00 | 0 | 0 | 0 | 0 |
| 22.04.2017 13:00 - 14:00 | 0 | 0 | 0 | 0 |
| 22.04.2017 14:00 - 15:00 | 0 | 0 | 0 | 0 |
| 22.04.2017 15:00 - 16:00 | 0 | 0 | 0 | 0 |
| 22.04.2017 16:00 - 17:00 | 0 | 0 | 0 | 0 |
| 22.04.2017 17:00 - 18:00 | 0 | 0 | 0 | 0 |
| 22.04.2017 18:00 - 19:00 | 0 | 0 | 0 | 0 |
| 22.04.2017 19:00 - 20:00 | 0 | 0 | 0 | 0 |
| 22.04.2017 20:00 - 21:00 | 0 | 0 | 0 | 0 |
| 22.04.2017 21:00 - 22:00 | 0 | 0 | 0 | 0 |
| 22.04.2017 22:00 - 23:00 | 0 | -500 | 0 | 0 |
| 22.04.2017 23:00 - 24:00 | 0 | -500 | 0 | 0 |
| 23.04.2017 00:00 - 01:00 | 0 | -500 | 0 | 0 |
| 23.04.2017 01:00 - 02:00 | 0 | -500 | 0 | 0 |
| 23.04.2017 02:00 - 03:00 | 0 | -1270 | 0 | 0 |
| 23.04.2017 03:00 - 04:00 | 0 | -1270 | 0 | 0 |
| 23.04.2017 04:00 - 05:00 | 0 | -1270 | 0 | 0 |
| 23.04.2017 05:00 - 06:00 | 0 | -1270 | 0 | 0 |
| 23.04.2017 06:00 - 07:00 | 0 | 0 | 0 | 0 |
| 23.04.2017 07:00 - 08:00 | 0 | 0 | 0 | 0 |
| 23.04.2017 08:00 - 09:00 | 0 | 0 | 0 | 0 |
| 23.04.2017 09:00 - 10:00 | 0 | 0 | 0 | 0 |
| 23.04.2017 10:00 - 11:00 | 0 | 0 | 0 | 0 |
| 23.04.2017 11:00 - 12:00 | 0 | 0 | 0 | 0 |
| 23.04.2017 12:00 - 13:00 | 0 | 0 | 0 | 0 |
| 23.04.2017 13:00 - 14:00 | 0 | 0 | 0 | 0 |
| 23.04.2017 14:00 - 15:00 | 0 | 0 | 0 | 0 |
| 23.04.2017 15:00 - 16:00 | 0 | 0 | 0 | 0 |
| 23.04.2017 16:00 - 17:00 | 0 | 0 | 0 | 0 |
| 23.04.2017 17:00 - 18:00 | 0 | 0 | 0 | 0 |
| 23.04.2017 18:00 - 19:00 | 0 | 0 | 0 | 0 |
| 23.04.2017 19:00 - 20:00 | 0 | 0 | 0 | 0 |
| 23.04.2017 20:00 - 21:00 | 0 | 0 | 0 | 0 |
| 23.04.2017 21:00 - 22:00 | 0 | 0 | 0 | 0 |
| 23.04.2017 22:00 - 23:00 | 0 | 0 | 0 | 0 |
| 23.04.2017 23:00 - 24:00 | 0 | 0 | 0 | 0 |
| 24.04.2017 00:00 - 01:00 | 0 | 0 | 0 | 0 |
| 24.04.2017 01:00 - 02:00 | 0 | 0 | 0 | 0 |
| 24.04.2017 02:00 - 03:00 | 0 | 0 | 0 | 0 |
| 24.04.2017 03:00 - 04:00 | 0 | 0 | 0 | 0 |
| 24.04.2017 04:00 - 05:00 | 0 | 0 | 0 | 0 |
| 24.04.2017 05:00 - 06:00 | 0 | 0 | 0 | 0 |
| 24.04.2017 06:00 - 07:00 | 0 | 0 | 0 | 0 |
| 24.04.2017 07:00 - 08:00 | 0 | 0 | 0 | 0 |
| 24.04.2017 08:00 - 09:00 | 0 | 0 | 0 | 0 |
| 24.04.2017 09:00 - 10:00 | 0 | 0 | 0 | 0 |
| 24.04.2017 10:00 - 11:00 | 0 | 0 | 0 | 0 |
| 24.04.2017 11:00 - 12:00 | 0 | 0 | 0 | 0 |
| 24.04.2017 12:00 - 13:00 | 0 | 0 | 0 | 0 |
| 24.04.2017 13:00 - 14:00 | 0 | 0 | 0 | 0 |
| 24.04.2017 14:00 - 15:00 | 0 | 0 | 0 | 0 |
| 24.04.2017 15:00 - 16:00 | 0 | 0 | 0 | 0 |
| 24.04.2017 16:00 - 17:00 | 0 | 0 | 0 | 0 |
| 24.04.2017 17:00 - 18:00 | 0 | 0 | 0 | 0 |
| 24.04.2017 18:00 - 19:00 | 0 | 0 | 0 | 0 |
| 24.04.2017 19:00 - 20:00 | 0 | 0 | 0 | 0 |
| 24.04.2017 20:00 - 21:00 | 0 | 0 | 0 | 0 |
| 24.04.2017 21:00 - 22:00 | 0 | 0 | 0 | 0 |
| 24.04.2017 22:00 - 23:00 | 0 | 0 | 0 | 0 |
| 24.04.2017 23:00 - 24:00 | 0 | 0 | 0 | 0 |
| 25.04.2017 00:00 - 01:00 | 0 | -800 | 0 | 0 |
| 25.04.2017 01:00 - 02:00 | 0 | -800 | 0 | 0 |
| 25.04.2017 02:00 - 03:00 | 0 | -800 | 0 | 0 |
| 25.04.2017 03:00 - 04:00 | 0 | -800 | 0 | 0 |
| 25.04.2017 04:00 - 05:00 | 0 | -800 | 0 | 0 |
| 25.04.2017 05:00 - 06:00 | 0 | -800 | 0 | 0 |
| 25.04.2017 06:00 - 07:00 | 0 | 0 | 0 | 0 |
| 25.04.2017 07:00 - 08:00 | 0 | 0 | 0 | 0 |
| 25.04.2017 08:00 - 09:00 | 0 | 0 | 0 | 0 |
| 25.04.2017 09:00 - 10:00 | 0 | 0 | 0 | 0 |
| 25.04.2017 10:00 - 11:00 | 0 | 0 | 0 | 0 |
| 25.04.2017 11:00 - 12:00 | 0 | 0 | 0 | 0 |
| 25.04.2017 12:00 - 13:00 | 0 | 0 | 0 | 0 |
| 25.04.2017 13:00 - 14:00 | 0 | -400 | 0 | 0 |
| 25.04.2017 14:00 - 15:00 | 0 | -400 | 0 | 0 |
| 25.04.2017 15:00 - 16:00 | 0 | -400 | 0 | 0 |
| 25.04.2017 16:00 - 17:00 | 0 | -400 | 0 | 0 |
| 25.04.2017 17:00 - 18:00 | 0 | -400 | 0 | 0 |
| 25.04.2017 18:00 - 19:00 | 0 | -400 | 0 | 0 |
| 25.04.2017 19:00 - 20:00 | 0 | -400 | 0 | 0 |
| 25.04.2017 20:00 - 21:00 | 0 | -400 | 0 | 0 |
| 25.04.2017 21:00 - 22:00 | 0 | -800 | 0 | 0 |
| 25.04.2017 22:00 - 23:00 | 0 | -800 | 0 | 0 |
| 25.04.2017 23:00 - 24:00 | 0 | -800 | 0 | 0 |
| 26.04.2017 00:00 - 01:00 | 0 | -800 | 0 | 0 |
| 26.04.2017 01:00 - 02:00 | 0 | -800 | 0 | 0 |
| 26.04.2017 02:00 - 03:00 | 0 | -800 | 0 | 0 |
| 26.04.2017 03:00 - 04:00 | 0 | -800 | 0 | 0 |
| 26.04.2017 04:00 - 05:00 | 0 | -800 | 0 | 0 |
| 26.04.2017 05:00 - 06:00 | 0 | -800 | 0 | 0 |
| 26.04.2017 06:00 - 07:00 | 0 | 0 | 0 | 0 |
| 26.04.2017 07:00 - 08:00 | 0 | 0 | 0 | 0 |
| 26.04.2017 08:00 - 09:00 | 0 | 0 | 0 | 0 |
| 26.04.2017 09:00 - 10:00 | 0 | 0 | 0 | 0 |
| 26.04.2017 10:00 - 11:00 | 0 | 0 | 0 | 0 |
| 26.04.2017 11:00 - 12:00 | 0 | 0 | 0 | 0 |
| 26.04.2017 12:00 - 13:00 | 0 | 0 | 0 | 0 |
| 26.04.2017 13:00 - 14:00 | 0 | 0 | 0 | 0 |
| 26.04.2017 14:00 - 15:00 | 0 | 0 | 0 | 0 |
| 26.04.2017 15:00 - 16:00 | 0 | 0 | 0 | 0 |
| 26.04.2017 16:00 - 17:00 | 0 | 0 | 0 | 0 |
| 26.04.2017 17:00 - 18:00 | 0 | 0 | 0 | 0 |
| 26.04.2017 18:00 - 19:00 | 0 | 0 | 0 | 0 |
| 26.04.2017 19:00 - 20:00 | 0 | 0 | 0 | 0 |
| 26.04.2017 20:00 - 21:00 | 0 | 0 | 0 | 0 |
| 26.04.2017 21:00 - 22:00 | 0 | 0 | 0 | 0 |
| 26.04.2017 22:00 - 23:00 | 0 | 0 | 0 | 0 |
| 26.04.2017 23:00 - 24:00 | 0 | 0 | 0 | 0 |
| 27.04.2017 00:00 - 01:00 | 0 | 0 | 0 | 0 |
| 27.04.2017 01:00 - 02:00 | 0 | 0 | 0 | 0 |
| 27.04.2017 02:00 - 03:00 | 0 | 0 | 0 | 0 |
| 27.04.2017 03:00 - 04:00 | 0 | 0 | 0 | 0 |
| 27.04.2017 04:00 - 05:00 | 0 | 0 | 0 | 0 |
| 27.04.2017 05:00 - 06:00 | 0 | 0 | 0 | 0 |
| 27.04.2017 06:00 - 07:00 | 0 | 0 | 0 | 0 |
| 27.04.2017 07:00 - 08:00 | 0 | 0 | 0 | 0 |
| 27.04.2017 08:00 - 09:00 | 0 | 0 | 0 | 0 |
| 27.04.2017 09:00 - 10:00 | 0 | 0 | 0 | 0 |
| 27.04.2017 10:00 - 11:00 | 0 | 0 | 0 | 0 |
| 27.04.2017 11:00 - 12:00 | 0 | 0 | 0 | 0 |
| 27.04.2017 12:00 - 13:00 | 0 | 0 | 0 | 0 |
| 27.04.2017 13:00 - 14:00 | 0 | 0 | 0 | 0 |
| 27.04.2017 14:00 - 15:00 | 0 | 0 | 0 | 0 |
| 27.04.2017 15:00 - 16:00 | 0 | 0 | 0 | 0 |
| 27.04.2017 16:00 - 17:00 | 0 | 0 | 0 | 0 |
| 27.04.2017 17:00 - 18:00 | 0 | 0 | 0 | 0 |
| 27.04.2017 18:00 - 19:00 | 0 | 0 | 0 | 0 |
| 27.04.2017 19:00 - 20:00 | 0 | 0 | 0 | 0 |
| 27.04.2017 20:00 - 21:00 | 0 | 0 | 0 | 0 |
| 27.04.2017 21:00 - 22:00 | 0 | 0 | 0 | 0 |
| 27.04.2017 22:00 - 23:00 | 300 | 0 | 0 | 0 |
| 27.04.2017 23:00 - 24:00 | 300 | 0 | 0 | 0 |
| 28.04.2017 00:00 - 01:00 | 300 | 0 | 0 | 0 |
| 28.04.2017 01:00 - 02:00 | 300 | 0 | 0 | 0 |
| 28.04.2017 02:00 - 03:00 | 300 | 0 | 0 | 0 |
| 28.04.2017 03:00 - 04:00 | 300 | 0 | 0 | 0 |
| 28.04.2017 04:00 - 05:00 | 300 | 0 | 0 | 0 |
| 28.04.2017 05:00 - 06:00 | 300 | 0 | 0 | 0 |
| 28.04.2017 06:00 - 07:00 | 0 | 0 | 0 | 0 |
| 28.04.2017 07:00 - 08:00 | 250 | 0 | 0 | 0 |
| 28.04.2017 08:00 - 09:00 | 250 | 0 | 0 | 0 |
| 28.04.2017 09:00 - 10:00 | 250 | 0 | 0 | 0 |
| 28.04.2017 10:00 - 11:00 | 250 | 0 | 0 | 0 |
| 28.04.2017 11:00 - 12:00 | 250 | 0 | 0 | 0 |
| 28.04.2017 12:00 - 13:00 | 250 | 0 | 0 | 0 |
| 28.04.2017 13:00 - 14:00 | 250 | 0 | 0 | 0 |
| 28.04.2017 14:00 - 15:00 | 250 | 0 | 0 | 0 |
| 28.04.2017 15:00 - 16:00 | 250 | 0 | 0 | 0 |
| 28.04.2017 16:00 - 17:00 | 250 | 0 | 0 | 0 |
| 28.04.2017 17:00 - 18:00 | 250 | 0 | 0 | 0 |
| 28.04.2017 18:00 - 19:00 | 250 | 0 | 0 | 0 |
| 28.04.2017 19:00 - 20:00 | 250 | 0 | 0 | 0 |
| 28.04.2017 20:00 - 21:00 | 250 | 0 | 0 | 0 |
| 28.04.2017 21:00 - 22:00 | 250 | 0 | 0 | 0 |
| 28.04.2017 22:00 - 23:00 | 250 | 0 | 0 | 0 |
| 28.04.2017 23:00 - 24:00 | 250 | 0 | 0 | 0 |
| 29.04.2017 00:00 - 01:00 | 250 | 0 | 0 | 0 |
| 29.04.2017 01:00 - 02:00 | 250 | 0 | 0 | 0 |
| 29.04.2017 02:00 - 03:00 | 250 | 0 | 0 | 0 |
| 29.04.2017 03:00 - 04:00 | 250 | 0 | 0 | 0 |
| 29.04.2017 04:00 - 05:00 | 250 | 0 | 0 | 0 |
| 29.04.2017 05:00 - 06:00 | 250 | 0 | 0 | 0 |
| 29.04.2017 06:00 - 07:00 | 0 | 0 | 0 | 0 |
| 29.04.2017 07:00 - 08:00 | 0 | 0 | 0 | 0 |
| 29.04.2017 08:00 - 09:00 | 0 | 0 | 0 | 0 |
| 29.04.2017 09:00 - 10:00 | 0 | 0 | 0 | 0 |
| 29.04.2017 10:00 - 11:00 | 0 | 0 | 0 | 0 |
| 29.04.2017 11:00 - 12:00 | 0 | 0 | 0 | 0 |
| 29.04.2017 12:00 - 13:00 | 0 | 0 | 0 | 0 |
| 29.04.2017 13:00 - 14:00 | 0 | 0 | 0 | 0 |
| 29.04.2017 14:00 - 15:00 | 0 | 0 | 0 | 0 |
| 29.04.2017 15:00 - 16:00 | 0 | 0 | 0 | 0 |
| 29.04.2017 16:00 - 17:00 | 0 | 0 | 0 | 0 |
| 29.04.2017 17:00 - 18:00 | 0 | 0 | 0 | 0 |
| 29.04.2017 18:00 - 19:00 | 0 | 0 | 0 | 0 |
| 29.04.2017 19:00 - 20:00 | 0 | 0 | 0 | 0 |
| 29.04.2017 20:00 - 21:00 | 0 | 0 | 0 | 0 |
| 29.04.2017 21:00 - 22:00 | 0 | 0 | 0 | 0 |
| 29.04.2017 22:00 - 23:00 | 0 | 0 | 0 | 0 |
| 29.04.2017 23:00 - 24:00 | 0 | -300 | 0 | 0 |
| 30.04.2017 00:00 - 01:00 | 0 | -300 | 0 | 0 |
| 30.04.2017 01:00 - 02:00 | 0 | -300 | 0 | 0 |
| 30.04.2017 02:00 - 03:00 | 0 | -300 | 0 | 0 |
| 30.04.2017 03:00 - 04:00 | 0 | -300 | 0 | 0 |
| 30.04.2017 04:00 - 05:00 | 0 | -300 | 0 | 0 |
| 30.04.2017 05:00 - 06:00 | 0 | -300 | 0 | 0 |
| 30.04.2017 06:00 - 07:00 | 0 | 0 | 0 | 0 |
| 30.04.2017 07:00 - 08:00 | 0 | 0 | 0 | 0 |
| 30.04.2017 08:00 - 09:00 | 0 | 0 | 0 | 0 |
| 30.04.2017 09:00 - 10:00 | 0 | 0 | 0 | 0 |
| 30.04.2017 10:00 - 11:00 | 0 | 0 | 0 | 0 |
| 30.04.2017 11:00 - 12:00 | 0 | 0 | 0 | 0 |
| 30.04.2017 12:00 - 13:00 | 0 | 0 | 0 | 0 |
| 30.04.2017 13:00 - 14:00 | 0 | 0 | 0 | 0 |
| 30.04.2017 14:00 - 15:00 | 0 | 0 | 0 | 0 |
| 30.04.2017 15:00 - 16:00 | 0 | 0 | 0 | 0 |
| 30.04.2017 16:00 - 17:00 | 0 | 0 | 0 | 0 |
| 30.04.2017 17:00 - 18:00 | 0 | 0 | 0 | 0 |
| 30.04.2017 18:00 - 19:00 | 0 | 0 | 0 | 0 |
| 30.04.2017 19:00 - 20:00 | 0 | 0 | 0 | 0 |
| 30.04.2017 20:00 - 21:00 | 0 | 0 | 0 | 0 |
| 30.04.2017 21:00 - 22:00 | 0 | 0 | 0 | 0 |
| 30.04.2017 22:00 - 23:00 | 0 | 0 | 0 | 0 |
| 30.04.2017 23:00 - 24:00 | 0 | 0 | 0 | 0 |
| 01.05.2017 00:00 - 01:00 | 0 | 0 | 0 | 0 |
| 01.05.2017 01:00 - 02:00 | 0 | -200 | 0 | 0 |
| 01.05.2017 02:00 - 03:00 | 0 | -700 | 0 | 0 |
| 01.05.2017 03:00 - 04:00 | 0 | -700 | 0 | 0 |
| 01.05.2017 04:00 - 05:00 | 0 | -700 | 0 | 0 |
| 01.05.2017 05:00 - 06:00 | 0 | -700 | 0 | 0 |